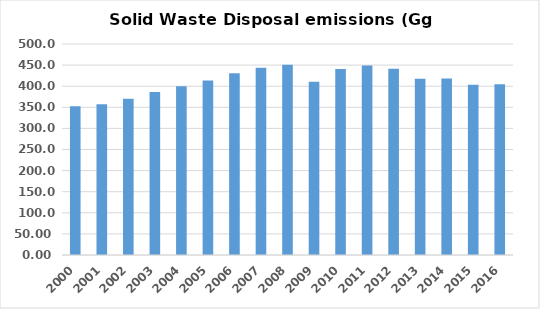
| Category | Series 0 |
|---|---|
| 2000.0 | 352.645 |
| 2001.0 | 356.954 |
| 2002.0 | 370.035 |
| 2003.0 | 386.472 |
| 2004.0 | 400.096 |
| 2005.0 | 413.28 |
| 2006.0 | 430.848 |
| 2007.0 | 443.772 |
| 2008.0 | 450.692 |
| 2009.0 | 410.477 |
| 2010.0 | 440.994 |
| 2011.0 | 449.123 |
| 2012.0 | 441.589 |
| 2013.0 | 417.598 |
| 2014.0 | 418.274 |
| 2015.0 | 403.605 |
| 2016.0 | 404.375 |